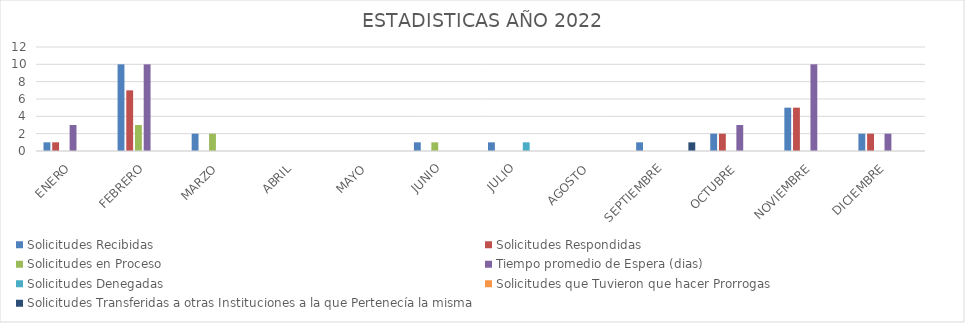
| Category | Solicitudes Recibidas | Solicitudes Respondidas | Solicitudes en Proceso | Tiempo promedio de Espera (dias) | Solicitudes Denegadas | Solicitudes que Tuvieron que hacer Prorrogas  | Solicitudes Transferidas a otras Instituciones a la que Pertenecía la misma |
|---|---|---|---|---|---|---|---|
| ENERO | 1 | 1 | 0 | 3 | 0 | 0 | 0 |
| FEBRERO | 10 | 7 | 3 | 10 | 0 | 0 | 0 |
| MARZO | 2 | 0 | 2 | 0 | 0 | 0 | 0 |
| ABRIL | 0 | 0 | 0 | 0 | 0 | 0 | 0 |
| MAYO | 0 | 0 | 0 | 0 | 0 | 0 | 0 |
| JUNIO | 1 | 0 | 1 | 0 | 0 | 0 | 0 |
| JULIO | 1 | 0 | 0 | 0 | 1 | 0 | 0 |
| AGOSTO | 0 | 0 | 0 | 0 | 0 | 0 | 0 |
| SEPTIEMBRE | 1 | 0 | 0 | 0 | 0 | 0 | 1 |
| OCTUBRE | 2 | 2 | 0 | 3 | 0 | 0 | 0 |
| NOVIEMBRE | 5 | 5 | 0 | 10 | 0 | 0 | 0 |
| DICIEMBRE | 2 | 2 | 0 | 2 | 0 | 0 | 0 |